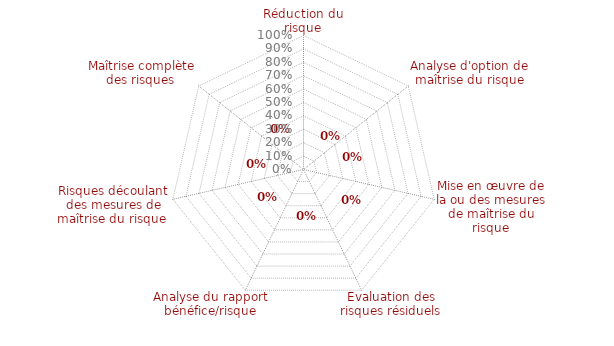
| Category | 6.7 Maîtrise complète des risques  en attente |
|---|---|
| 0 | 0 |
| 1 | 0 |
| 2 | 0 |
| 3 | 0 |
| 4 | 0 |
| 5 | 0 |
| 6 | 0 |